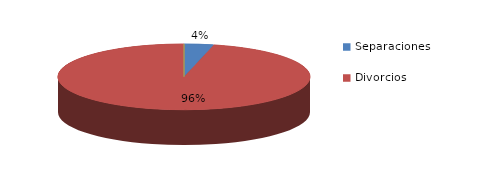
| Category | Series 0 |
|---|---|
| Separaciones | 18 |
| Divorcios | 458 |
| Uniones de hecho | 0 |